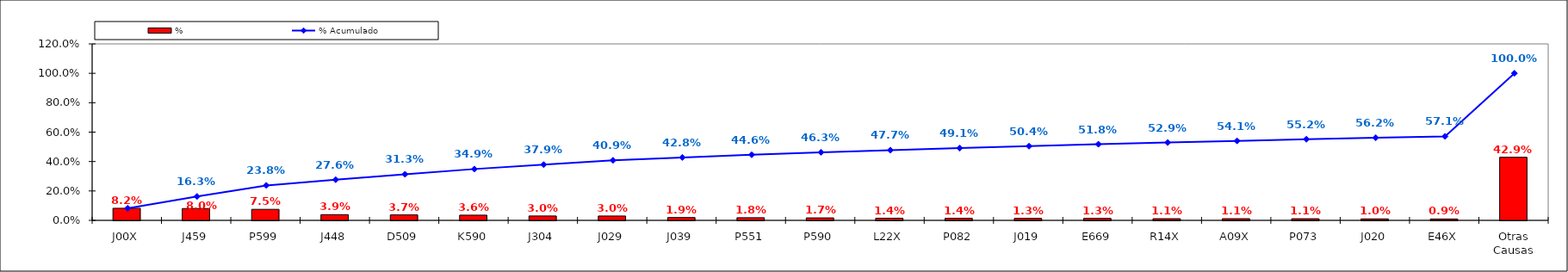
| Category | % |
|---|---|
| J00X | 0.082 |
| J459 | 0.08 |
| P599 | 0.075 |
| J448 | 0.039 |
| D509 | 0.037 |
| K590 | 0.036 |
| J304 | 0.03 |
| J029 | 0.03 |
| J039 | 0.019 |
| P551 | 0.018 |
| P590 | 0.017 |
| L22X | 0.014 |
| P082 | 0.014 |
| J019 | 0.013 |
| E669 | 0.013 |
| R14X | 0.011 |
| A09X | 0.011 |
| P073 | 0.011 |
| J020 | 0.01 |
| E46X | 0.009 |
| Otras Causas | 0.429 |